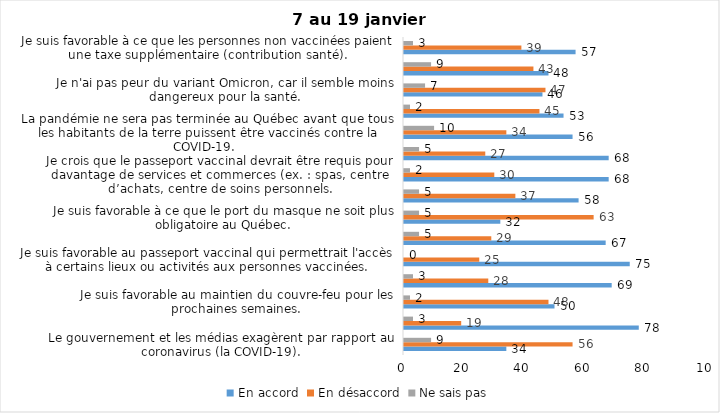
| Category | En accord | En désaccord | Ne sais pas |
|---|---|---|---|
| Le gouvernement et les médias exagèrent par rapport au coronavirus (la COVID-19). | 34 | 56 | 9 |
| J’ai peur que le système de santé soit débordé par les cas de COVID-19. | 78 | 19 | 3 |
| Je suis favorable au maintien du couvre-feu pour les prochaines semaines. | 50 | 48 | 2 |
| Je suis inquiet/inquiète que le nombre de cas augmente en raison des nouveaux variants du virus de la COVID-19. | 69 | 28 | 3 |
| Je suis favorable au passeport vaccinal qui permettrait l'accès à certains lieux ou activités aux personnes vaccinées. | 75 | 25 | 0 |
| Je suis confiant que la vaccination protège efficacement contre les variants de la COVID-19 | 67 | 29 | 5 |
| Je suis favorable à ce que le port du masque ne soit plus obligatoire au Québec. | 32 | 63 | 5 |
| J'ai peur que la reprise des cours en présentiel dans les écoles primaires et secondaires génère une augmentation des cas de COVID-19 | 58 | 37 | 5 |
| Je crois que le passeport vaccinal devrait être requis pour davantage de services et commerces (ex. : spas, centre d’achats, centre de soins personnels. | 68 | 30 | 2 |
| Les personnes non adéquatement vaccinées contre la COVID-19 sont responsables des nouveaux cas et hospitalisations et contribuent à la prolongation de la pandémie au Québec. | 68 | 27 | 5 |
| La pandémie ne sera pas terminée au Québec avant que tous les habitants de la terre puissent être vaccinés contre la COVID-19.   | 56 | 34 | 10 |
| Je suis inconfortable d’être en contact avec une personne non vaccinée contre la COVID-19 | 53 | 45 | 2 |
| Je n'ai pas peur du variant Omicron, car il semble moins dangereux pour la santé. | 46 | 47 | 7 |
| La vaccination obligatoire contre la COVID-19 mettrait fin à la pandémie. | 48 | 43 | 9 |
| Je suis favorable à ce que les personnes non vaccinées paient une taxe supplémentaire (contribution santé). | 57 | 39 | 3 |